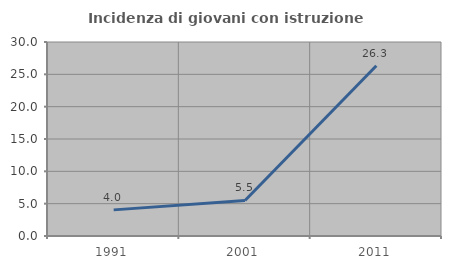
| Category | Incidenza di giovani con istruzione universitaria |
|---|---|
| 1991.0 | 4.04 |
| 2001.0 | 5.495 |
| 2011.0 | 26.316 |